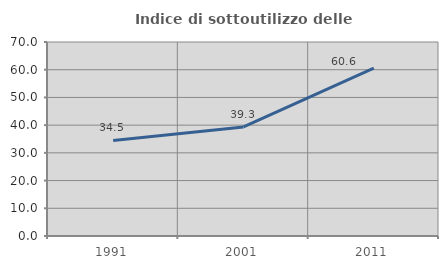
| Category | Indice di sottoutilizzo delle abitazioni  |
|---|---|
| 1991.0 | 34.5 |
| 2001.0 | 39.336 |
| 2011.0 | 60.577 |